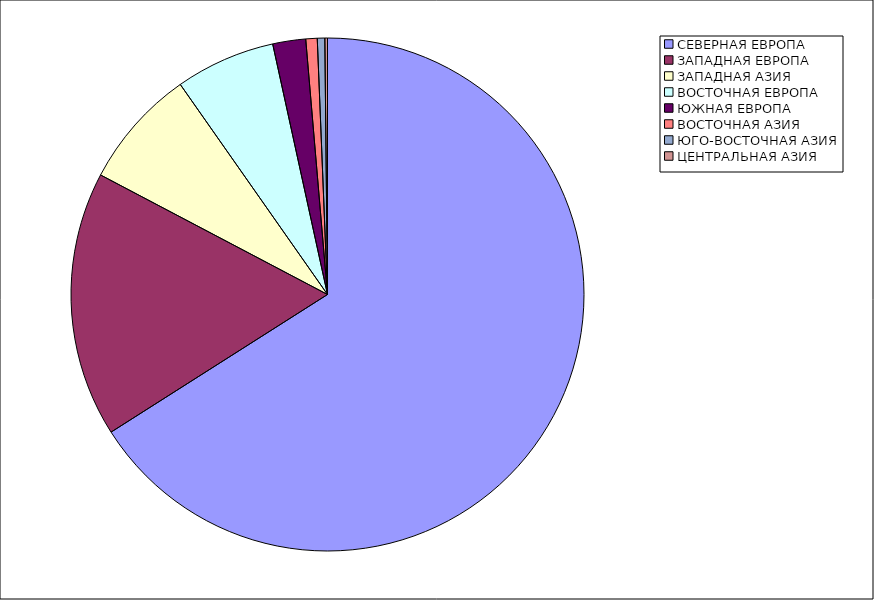
| Category | Оборот |
|---|---|
| СЕВЕРНАЯ ЕВРОПА | 65.986 |
| ЗАПАДНАЯ ЕВРОПА | 16.729 |
| ЗАПАДНАЯ АЗИЯ | 7.556 |
| ВОСТОЧНАЯ ЕВРОПА | 6.301 |
| ЮЖНАЯ ЕВРОПА | 2.074 |
| ВОСТОЧНАЯ АЗИЯ | 0.717 |
| ЮГО-ВОСТОЧНАЯ АЗИЯ | 0.472 |
| ЦЕНТРАЛЬНАЯ АЗИЯ | 0.165 |